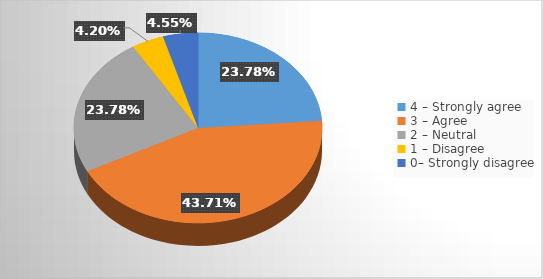
| Category | Series 0 |
|---|---|
| 4 – Strongly agree  | 0.238 |
| 3 – Agree  | 0.437 |
| 2 – Neutral   | 0.238 |
| 1 – Disagree   | 0.042 |
| 0– Strongly disagree | 0.046 |